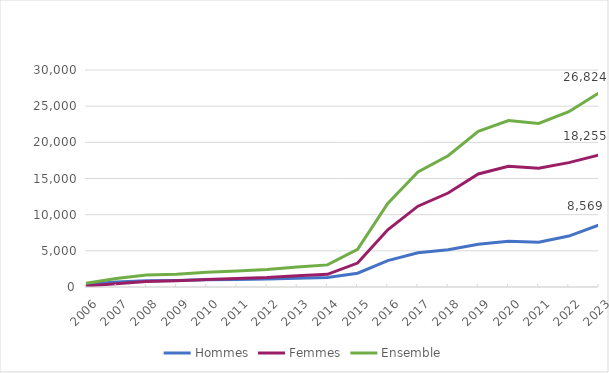
| Category | Hommes | Femmes | Ensemble |
|---|---|---|---|
| 2006.0 | 383 | 146 | 529 |
| 2007.0 | 704 | 460 | 1164 |
| 2008.0 | 872 | 775 | 1647 |
| 2009.0 | 895 | 880 | 1775 |
| 2010.0 | 1004 | 1025 | 2029 |
| 2011.0 | 1031 | 1166 | 2197 |
| 2012.0 | 1101 | 1308 | 2409 |
| 2013.0 | 1215 | 1554 | 2769 |
| 2014.0 | 1307 | 1750 | 3057 |
| 2015.0 | 1901 | 3307 | 5208 |
| 2016.0 | 3655 | 7906 | 11561 |
| 2017.0 | 4738 | 11173 | 15911 |
| 2018.0 | 5155 | 12995 | 18150 |
| 2019.0 | 5907 | 15620 | 21527 |
| 2020.0 | 6337 | 16683 | 23020 |
| 2021.0 | 6192 | 16412 | 22604 |
| 2022.0 | 7040 | 17197 | 24237 |
| 2023.0 | 8569 | 18255 | 26824 |